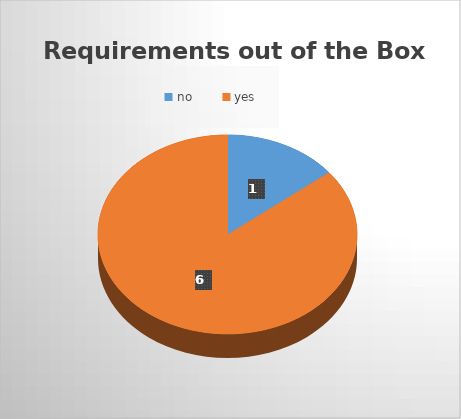
| Category | Ability |
|---|---|
| no | 1 |
| yes | 6 |